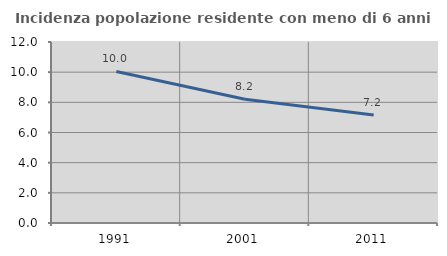
| Category | Incidenza popolazione residente con meno di 6 anni |
|---|---|
| 1991.0 | 10.045 |
| 2001.0 | 8.207 |
| 2011.0 | 7.156 |